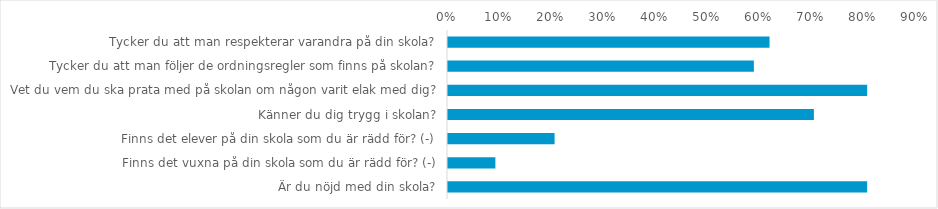
| Category | (Alla) |
|---|---|
| Tycker du att man respekterar varandra på din skola? | 0.617 |
| Tycker du att man följer de ordningsregler som finns på skolan? | 0.587 |
| Vet du vem du ska prata med på skolan om någon varit elak med dig? | 0.804 |
| Känner du dig trygg i skolan? | 0.702 |
| Finns det elever på din skola som du är rädd för? (-) | 0.205 |
| Finns det vuxna på din skola som du är rädd för? (-) | 0.091 |
| Är du nöjd med din skola? | 0.804 |